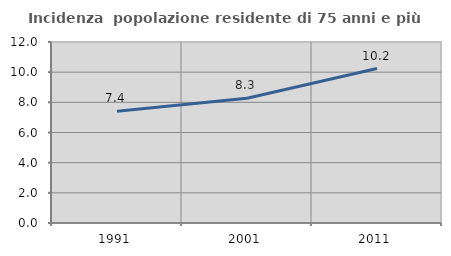
| Category | Incidenza  popolazione residente di 75 anni e più |
|---|---|
| 1991.0 | 7.416 |
| 2001.0 | 8.272 |
| 2011.0 | 10.241 |